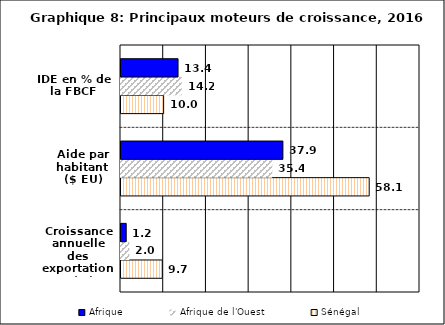
| Category | Sénégal | Afrique de l'Ouest | Afrique |
|---|---|---|---|
| Croissance annuelle des exportations (%) | 9.663 | 1.951 | 1.219 |
| Aide par habitant ($ EU) | 58.107 | 35.416 | 37.904 |
| IDE en % de la FBCF | 9.977 | 14.214 | 13.354 |